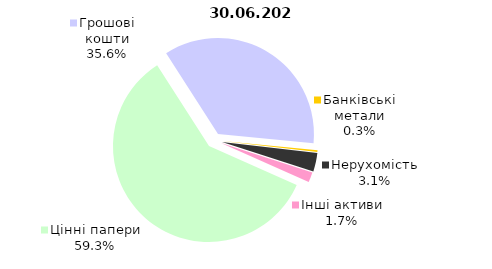
| Category | 30.06.2021 |
|---|---|
| Цінні папери | 2199.916 |
| Грошові кошти | 1323.144 |
| Банківські метали | 10.719 |
| Нерухомість | 115.995 |
| Інші активи | 63.11 |